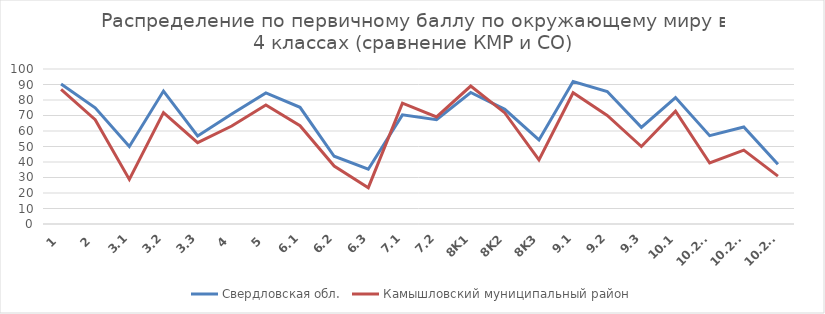
| Category | Свердловская обл. | Камышловский муниципальный район |
|---|---|---|
| 1 | 90.36 | 86.81 |
| 2 | 74.94 | 67.32 |
| 3,1 | 49.99 | 28.74 |
| 3,2 | 85.75 | 71.85 |
| 3,3 | 56.82 | 52.49 |
| 4 | 71.04 | 63.19 |
| 5 | 84.59 | 76.77 |
| 6,1 | 75.27 | 63.39 |
| 6,2 | 43.7 | 37.4 |
| 6,3 | 35.32 | 23.43 |
| 7,1 | 70.42 | 77.95 |
| 7,2 | 67.27 | 69.09 |
| 8K1 | 84.85 | 88.98 |
| 8K2 | 73.96 | 71.65 |
| 8K3 | 54.25 | 41.34 |
| 9,1 | 91.9 | 84.65 |
| 9,2 | 85.5 | 70.08 |
| 9,3 | 62.33 | 50 |
| 10,1 | 81.61 | 72.83 |
| 10.2K1 | 57 | 39.37 |
| 10.2K2 | 62.56 | 47.64 |
| 10.2K3 | 38.48 | 30.91 |